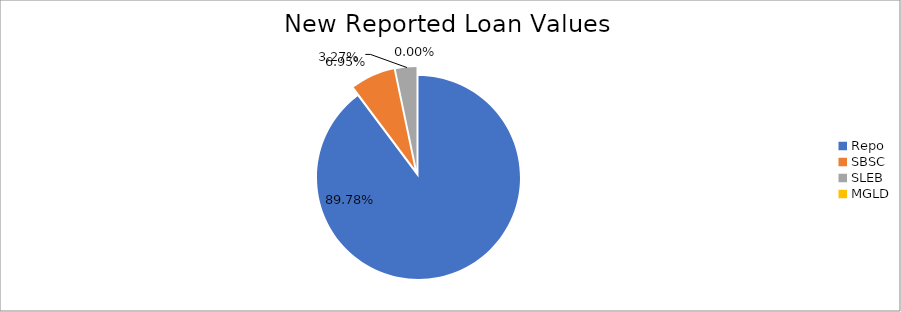
| Category | Series 0 |
|---|---|
| Repo | 12662033.909 |
| SBSC | 979915.209 |
| SLEB | 461755.482 |
| MGLD | 324.555 |